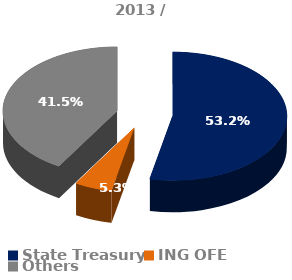
| Category | Struktura akcjonariatu 2011 |
|---|---|
| State Treasury | 0.532 |
| ING OFE | 0.053 |
| Others | 0.415 |